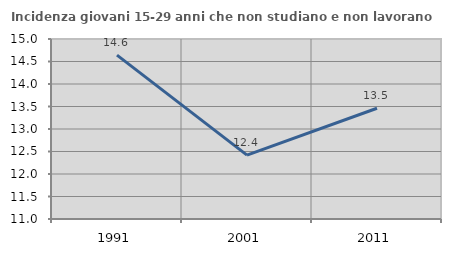
| Category | Incidenza giovani 15-29 anni che non studiano e non lavorano  |
|---|---|
| 1991.0 | 14.641 |
| 2001.0 | 12.42 |
| 2011.0 | 13.462 |